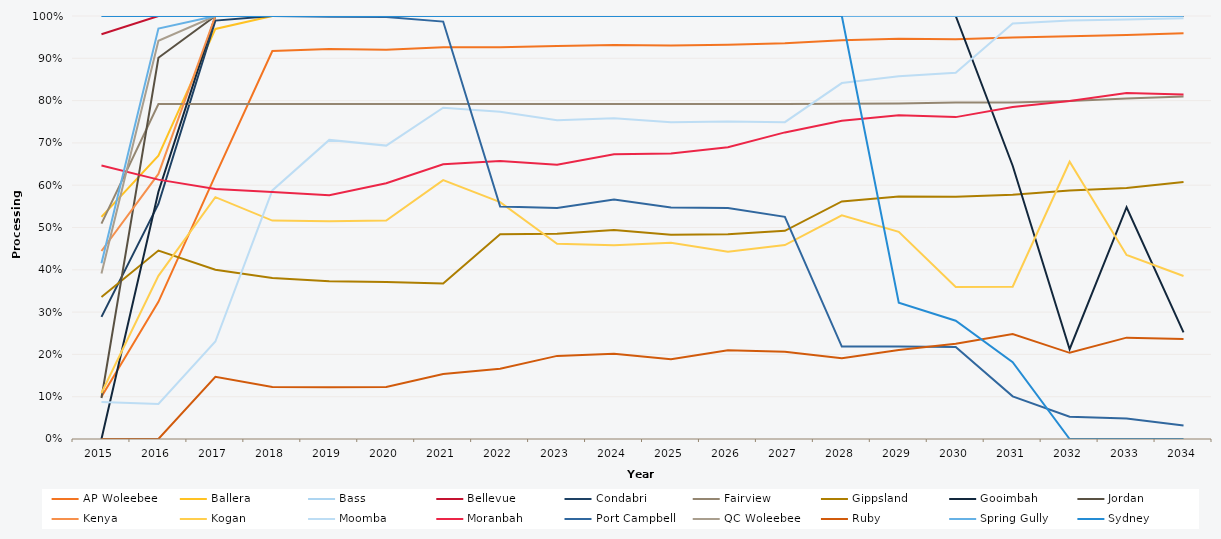
| Category | AP Woleebee | Ballera | Bass | Bellevue | Condabri | Fairview | Gippsland | Gooimbah | Jordan | Kenya | Kogan | Moomba | Moranbah | Port Campbell | QC Woleebee | Ruby | Spring Gully | Sydney |
|---|---|---|---|---|---|---|---|---|---|---|---|---|---|---|---|---|---|---|
| 2015.0 | 0.1 | 0.525 | 1 | 0.957 | 0.289 | 0.509 | 0.336 | 0 | 0.097 | 0.444 | 0.109 | 0.088 | 0.646 | 1.496 | 0.391 | 0 | 0.415 | 1 |
| 2016.0 | 0.324 | 0.67 | 1 | 1 | 0.556 | 0.792 | 0.446 | 0.585 | 0.901 | 0.627 | 0.386 | 0.083 | 0.613 | 1 | 0.941 | 0 | 0.971 | 1 |
| 2017.0 | 0.623 | 0.969 | 1 | 1 | 0.989 | 0.792 | 0.4 | 1 | 1 | 1 | 0.572 | 0.23 | 0.591 | 1 | 1 | 0.147 | 1 | 1 |
| 2018.0 | 0.917 | 1 | 1 | 1 | 1 | 0.792 | 0.381 | 1 | 1 | 1 | 0.516 | 0.588 | 0.584 | 1 | 1 | 0.123 | 1 | 1 |
| 2019.0 | 0.922 | 1 | 1 | 1 | 1 | 0.792 | 0.373 | 1 | 1 | 1 | 0.515 | 0.707 | 0.576 | 0.998 | 1 | 0.123 | 1 | 1 |
| 2020.0 | 0.92 | 1 | 1 | 1 | 1 | 0.792 | 0.371 | 1 | 1 | 1 | 0.517 | 0.694 | 0.604 | 0.997 | 1 | 0.123 | 1 | 1 |
| 2021.0 | 0.926 | 1 | 1 | 1 | 1 | 0.792 | 0.368 | 1 | 1 | 1 | 0.612 | 0.783 | 0.649 | 0.987 | 1 | 0.154 | 1 | 1 |
| 2022.0 | 0.926 | 1 | 1 | 1 | 1 | 0.792 | 0.484 | 1 | 1 | 1 | 0.56 | 0.773 | 0.657 | 0.55 | 1 | 0.166 | 1 | 1 |
| 2023.0 | 0.929 | 1 | 1 | 1 | 1 | 0.792 | 0.485 | 1 | 1 | 1 | 0.462 | 0.754 | 0.649 | 0.546 | 1 | 0.196 | 1 | 1 |
| 2024.0 | 0.932 | 1 | 1 | 1 | 1 | 0.792 | 0.494 | 1 | 1 | 1 | 0.458 | 0.758 | 0.673 | 0.566 | 1 | 0.202 | 1 | 1 |
| 2025.0 | 0.93 | 1 | 1 | 1 | 1 | 0.792 | 0.483 | 1 | 1 | 1 | 0.464 | 0.749 | 0.675 | 0.548 | 1 | 0.188 | 1 | 1 |
| 2026.0 | 0.932 | 1 | 1 | 1 | 1 | 0.792 | 0.484 | 1 | 1 | 1 | 0.443 | 0.75 | 0.69 | 0.546 | 1 | 0.21 | 1 | 1 |
| 2027.0 | 0.936 | 1 | 1 | 1 | 1 | 0.792 | 0.492 | 1 | 1 | 1 | 0.458 | 0.749 | 0.725 | 0.525 | 1 | 0.206 | 1 | 1 |
| 2028.0 | 0.942 | 1 | 1 | 1 | 1 | 0.793 | 0.562 | 1 | 1 | 1 | 0.529 | 0.841 | 0.752 | 0.219 | 1 | 0.191 | 1 | 1 |
| 2029.0 | 0.946 | 1 | 1 | 1 | 1 | 0.793 | 0.573 | 1 | 1 | 1 | 0.49 | 0.857 | 0.765 | 0.219 | 1 | 0.211 | 1 | 0.322 |
| 2030.0 | 0.945 | 1 | 1 | 1 | 1 | 0.795 | 0.573 | 1 | 1 | 1 | 0.359 | 0.866 | 0.761 | 0.218 | 1 | 0.225 | 1 | 0.28 |
| 2031.0 | 0.949 | 1 | 1 | 1 | 1 | 0.795 | 0.578 | 0.646 | 1 | 1 | 0.36 | 0.982 | 0.785 | 0.101 | 1 | 0.248 | 1 | 0.182 |
| 2032.0 | 0.952 | 1 | 1 | 1 | 1 | 0.799 | 0.588 | 0.212 | 1 | 1 | 0.655 | 0.989 | 0.799 | 0.053 | 1 | 0.204 | 1 | 0 |
| 2033.0 | 0.955 | 1 | 1 | 1 | 1 | 0.805 | 0.593 | 0.548 | 1 | 1 | 0.435 | 0.992 | 0.818 | 0.049 | 1 | 0.24 | 1 | 0 |
| 2034.0 | 0.959 | 1 | 1 | 1 | 1 | 0.81 | 0.607 | 0.252 | 1 | 1 | 0.385 | 0.995 | 0.814 | 0.032 | 1 | 0.237 | 1 | 0 |